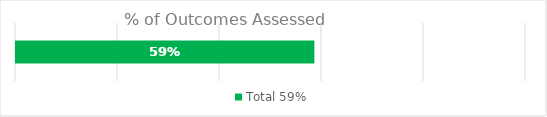
| Category | Total |
|---|---|
| 0 | 0.587 |